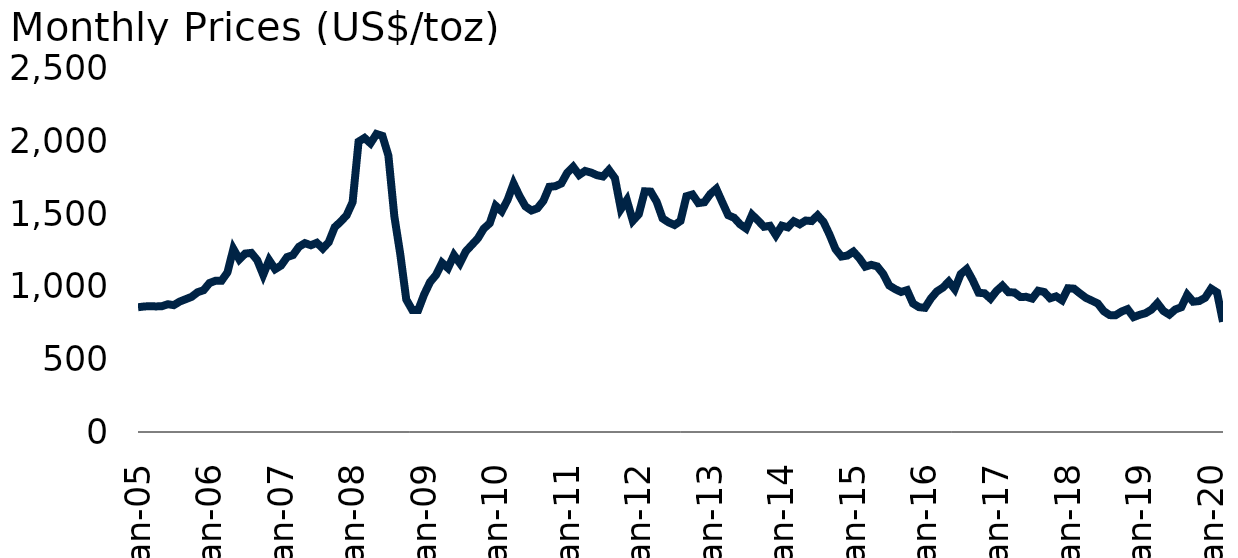
| Category | Platinum |
|---|---|
| 2005-01-01 | 859.07 |
| 2005-02-01 | 864.32 |
| 2005-03-01 | 866.83 |
| 2005-04-01 | 864.86 |
| 2005-05-01 | 866.23 |
| 2005-06-01 | 880.09 |
| 2005-07-01 | 873.67 |
| 2005-08-01 | 898.43 |
| 2005-09-01 | 914.64 |
| 2005-10-01 | 931 |
| 2005-11-01 | 962.61 |
| 2005-12-01 | 976.59 |
| 2006-01-01 | 1026.05 |
| 2006-02-01 | 1041.5 |
| 2006-03-01 | 1041.09 |
| 2006-04-01 | 1098.75 |
| 2006-05-01 | 1260.83 |
| 2006-06-01 | 1188.55 |
| 2006-07-01 | 1228.83 |
| 2006-08-01 | 1233.52 |
| 2006-09-01 | 1183.6 |
| 2006-10-01 | 1082.45 |
| 2006-11-01 | 1183 |
| 2006-12-01 | 1121.19 |
| 2007-01-01 | 1146.65 |
| 2007-02-01 | 1204.55 |
| 2007-03-01 | 1218.77 |
| 2007-04-01 | 1275.81 |
| 2007-05-01 | 1300.65 |
| 2007-06-01 | 1286.24 |
| 2007-07-01 | 1303.02 |
| 2007-08-01 | 1263.61 |
| 2007-09-01 | 1307.65 |
| 2007-10-01 | 1410.7 |
| 2007-11-01 | 1448.73 |
| 2007-12-01 | 1492.9 |
| 2008-01-01 | 1583.3 |
| 2008-02-01 | 1999.67 |
| 2008-03-01 | 2025.19 |
| 2008-04-01 | 1988.41 |
| 2008-05-01 | 2052.45 |
| 2008-06-01 | 2039.24 |
| 2008-07-01 | 1904.43 |
| 2008-08-01 | 1485.55 |
| 2008-09-01 | 1223.18 |
| 2008-10-01 | 912.57 |
| 2008-11-01 | 840.3 |
| 2008-12-01 | 839.7 |
| 2009-01-01 | 947.41 |
| 2009-02-01 | 1033.25 |
| 2009-03-01 | 1081.77 |
| 2009-04-01 | 1165.45 |
| 2009-05-01 | 1128.67 |
| 2009-06-01 | 1217.86 |
| 2009-07-01 | 1162.26 |
| 2009-08-01 | 1244.57 |
| 2009-09-01 | 1288.7 |
| 2009-10-01 | 1332.77 |
| 2009-11-01 | 1400.62 |
| 2009-12-01 | 1437.48 |
| 2010-01-01 | 1557.9 |
| 2010-02-01 | 1520.35 |
| 2010-03-01 | 1599.43 |
| 2010-04-01 | 1710.5 |
| 2010-05-01 | 1624.86 |
| 2010-06-01 | 1553.23 |
| 2010-07-01 | 1525.59 |
| 2010-08-01 | 1540.59 |
| 2010-09-01 | 1591.75 |
| 2010-10-01 | 1688.69 |
| 2010-11-01 | 1692.77 |
| 2010-12-01 | 1711.39 |
| 2011-01-01 | 1785.43 |
| 2011-02-01 | 1825.9 |
| 2011-03-01 | 1770.17 |
| 2011-04-01 | 1797.9 |
| 2011-05-01 | 1786.55 |
| 2011-06-01 | 1768.5 |
| 2011-07-01 | 1759.76 |
| 2011-08-01 | 1804.7 |
| 2011-09-01 | 1748.11 |
| 2011-10-01 | 1535.19 |
| 2011-11-01 | 1596.98 |
| 2011-12-01 | 1454.59 |
| 2012-01-01 | 1499.32 |
| 2012-02-01 | 1657.76 |
| 2012-03-01 | 1655.41 |
| 2012-04-01 | 1585.81 |
| 2012-05-01 | 1470.7 |
| 2012-06-01 | 1443.86 |
| 2012-07-01 | 1425.82 |
| 2012-08-01 | 1453.26 |
| 2012-09-01 | 1623.65 |
| 2012-10-01 | 1635.83 |
| 2012-11-01 | 1576.36 |
| 2012-12-01 | 1582.25 |
| 2013-01-01 | 1638.891 |
| 2013-02-01 | 1674.55 |
| 2013-03-01 | 1582.952 |
| 2013-04-01 | 1493.068 |
| 2013-05-01 | 1475.174 |
| 2013-06-01 | 1430.23 |
| 2013-07-01 | 1401.478 |
| 2013-08-01 | 1496.091 |
| 2013-09-01 | 1456.86 |
| 2013-10-01 | 1413.48 |
| 2013-11-01 | 1420.1 |
| 2013-12-01 | 1355.667 |
| 2014-01-01 | 1420.95 |
| 2014-02-01 | 1409.53 |
| 2014-03-01 | 1451.62 |
| 2014-04-01 | 1430.33 |
| 2014-05-01 | 1456.27 |
| 2014-06-01 | 1452.76 |
| 2014-07-01 | 1492.18 |
| 2014-08-01 | 1446.33 |
| 2014-09-01 | 1359.48 |
| 2014-10-01 | 1259.76 |
| 2014-11-01 | 1208.32 |
| 2014-12-01 | 1215.32 |
| 2015-01-01 | 1242.45 |
| 2015-02-01 | 1197.16 |
| 2015-03-01 | 1138.64 |
| 2015-04-01 | 1151.29 |
| 2015-05-01 | 1140.4 |
| 2015-06-01 | 1088.82 |
| 2015-07-01 | 1009.27 |
| 2015-08-01 | 984.1 |
| 2015-09-01 | 964.38 |
| 2015-10-01 | 976.91 |
| 2015-11-01 | 885.2 |
| 2015-12-01 | 859.82 |
| 2016-01-01 | 855.25 |
| 2016-02-01 | 919.35 |
| 2016-03-01 | 967.73 |
| 2016-04-01 | 994.19 |
| 2016-05-01 | 1035.86 |
| 2016-06-01 | 984.14 |
| 2016-07-01 | 1087.5 |
| 2016-08-01 | 1121.65 |
| 2016-09-01 | 1046.71 |
| 2016-10-01 | 959.14 |
| 2016-11-01 | 955.14 |
| 2016-12-01 | 918.38 |
| 2017-01-01 | 971.15 |
| 2017-02-01 | 1007.63 |
| 2017-03-01 | 962.87 |
| 2017-04-01 | 960.84 |
| 2017-05-01 | 930.27 |
| 2017-06-01 | 930.73 |
| 2017-07-01 | 918.9 |
| 2017-08-01 | 972.7 |
| 2017-09-01 | 964.1 |
| 2017-10-01 | 921 |
| 2017-11-01 | 934.05 |
| 2017-12-01 | 907.2 |
| 2018-01-01 | 990.12 |
| 2018-02-01 | 987.26 |
| 2018-03-01 | 954.57 |
| 2018-04-01 | 924.05 |
| 2018-05-01 | 904.73 |
| 2018-06-01 | 884.9 |
| 2018-07-01 | 832 |
| 2018-08-01 | 804.91 |
| 2018-09-01 | 804.79 |
| 2018-10-01 | 829.87 |
| 2018-11-01 | 846.19 |
| 2018-12-01 | 791.16 |
| 2019-01-01 | 806.77 |
| 2019-02-01 | 818.15 |
| 2019-03-01 | 842.81 |
| 2019-04-01 | 887.29 |
| 2019-05-01 | 833.55 |
| 2019-06-01 | 808.2 |
| 2019-07-01 | 843.95 |
| 2019-08-01 | 859.14 |
| 2019-09-01 | 944.7 |
| 2019-10-01 | 897.26 |
| 2019-11-01 | 901.8 |
| 2019-12-01 | 924.25 |
| 2020-01-01 | 987.36 |
| 2020-02-01 | 961.1 |
| 2020-03-01 | 759 |